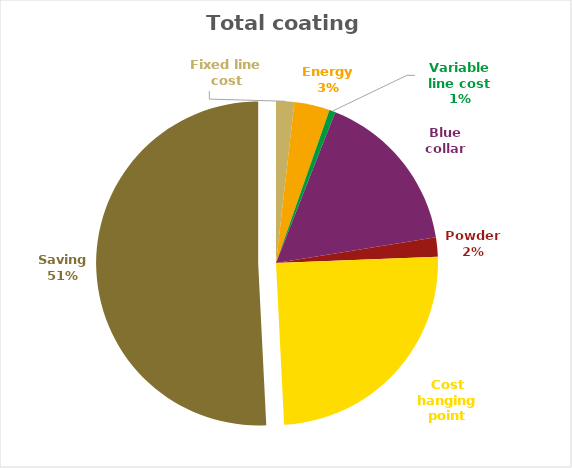
| Category | Series 0 | Series 1 |
|---|---|---|
| Fixed line cost | 0.001 | 0.018 |
| Energy | 0.003 | 0.035 |
| Variable line cost | 0 | 0.006 |
| Blue collar | 0.013 | 0.165 |
| Powder  | 0.002 | 0.019 |
| Cost hanging point | 0.019 | 0.248 |
| Saving | 0.039 | 0.508 |